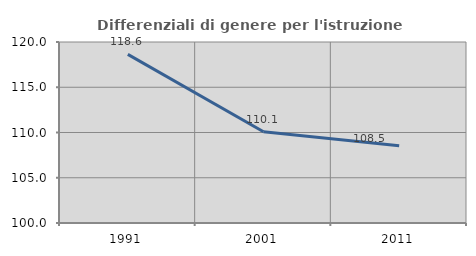
| Category | Differenziali di genere per l'istruzione superiore |
|---|---|
| 1991.0 | 118.631 |
| 2001.0 | 110.085 |
| 2011.0 | 108.528 |